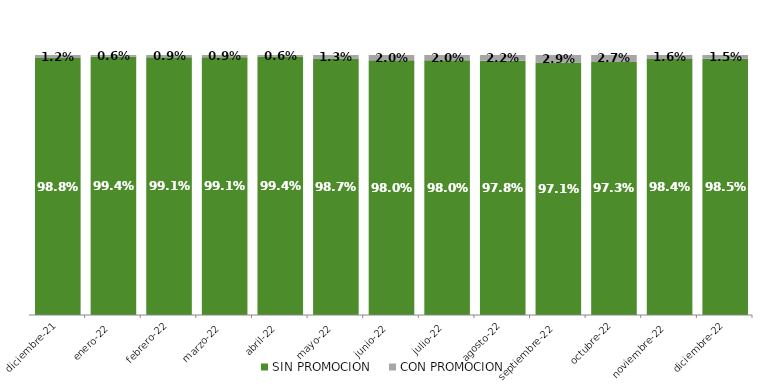
| Category | SIN PROMOCION   | CON PROMOCION   |
|---|---|---|
| 2021-12-01 | 0.988 | 0.012 |
| 2022-01-01 | 0.994 | 0.006 |
| 2022-02-01 | 0.991 | 0.009 |
| 2022-03-01 | 0.991 | 0.009 |
| 2022-04-01 | 0.994 | 0.006 |
| 2022-05-01 | 0.987 | 0.013 |
| 2022-06-01 | 0.98 | 0.02 |
| 2022-07-01 | 0.98 | 0.02 |
| 2022-08-01 | 0.978 | 0.022 |
| 2022-09-01 | 0.971 | 0.029 |
| 2022-10-01 | 0.973 | 0.027 |
| 2022-11-01 | 0.984 | 0.016 |
| 2022-12-01 | 0.985 | 0.015 |